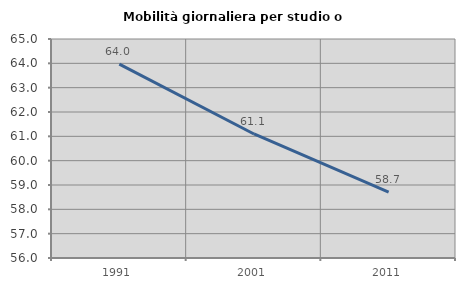
| Category | Mobilità giornaliera per studio o lavoro |
|---|---|
| 1991.0 | 63.971 |
| 2001.0 | 61.097 |
| 2011.0 | 58.704 |